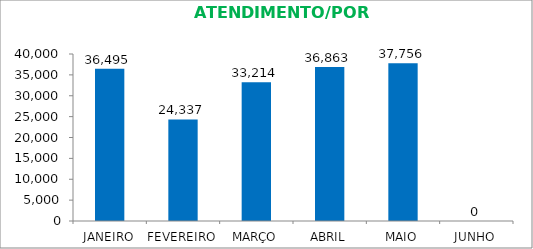
| Category | JANEIRO |
|---|---|
| JANEIRO | 36495 |
| FEVEREIRO | 24337 |
| MARÇO | 33214 |
| ABRIL | 36863 |
| MAIO | 37756 |
| JUNHO | 0 |